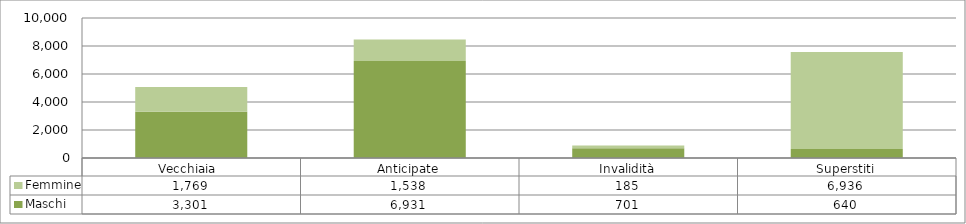
| Category | Maschi | Femmine |
|---|---|---|
| Vecchiaia  | 3301 | 1769 |
| Anticipate | 6931 | 1538 |
| Invalidità | 701 | 185 |
| Superstiti | 640 | 6936 |